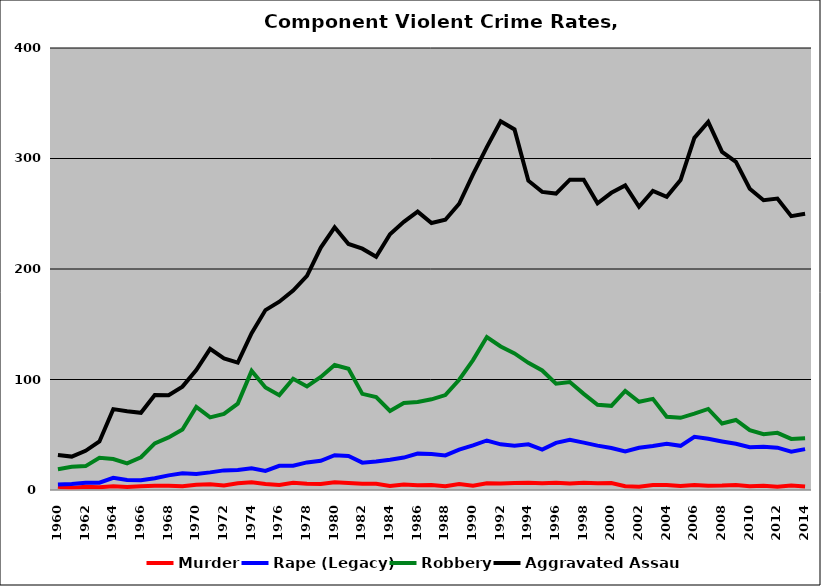
| Category | Murder | Rape (Legacy) | Robbery | Aggravated Assault |
|---|---|---|---|---|
| 1960.0 | 2.938 | 5.003 | 18.819 | 31.626 |
| 1961.0 | 1.869 | 5.378 | 20.966 | 30.219 |
| 1962.0 | 2.839 | 6.625 | 21.631 | 35.466 |
| 1963.0 | 2.562 | 6.652 | 29.124 | 43.955 |
| 1964.0 | 3.371 | 11.056 | 28 | 73.213 |
| 1965.0 | 2.686 | 9.132 | 24.038 | 71.218 |
| 1966.0 | 3.467 | 8.889 | 29.644 | 69.867 |
| 1967.0 | 3.956 | 10.681 | 42.154 | 85.978 |
| 1968.0 | 3.734 | 13.244 | 47.547 | 85.845 |
| 1969.0 | 3.49 | 15.08 | 54.761 | 93.537 |
| 1970.0 | 4.758 | 14.45 | 75.098 | 108.489 |
| 1971.0 | 5.093 | 15.943 | 65.678 | 127.768 |
| 1972.0 | 4.03 | 17.759 | 68.911 | 119.088 |
| 1973.0 | 6.011 | 18.034 | 78.148 | 115.27 |
| 1974.0 | 6.916 | 19.692 | 107.797 | 141.894 |
| 1975.0 | 5.382 | 17.247 | 92.766 | 162.814 |
| 1976.0 | 4.502 | 21.905 | 85.844 | 170.39 |
| 1977.0 | 6.578 | 21.969 | 100.731 | 180.525 |
| 1978.0 | 5.664 | 24.957 | 93.739 | 193.825 |
| 1979.0 | 5.488 | 26.425 | 102.279 | 219.375 |
| 1980.0 | 6.922 | 31.51 | 113.131 | 237.771 |
| 1981.0 | 6.342 | 30.785 | 109.66 | 222.638 |
| 1982.0 | 5.731 | 24.751 | 87.002 | 218.397 |
| 1983.0 | 5.649 | 25.856 | 84.041 | 211.01 |
| 1984.0 | 3.651 | 27.441 | 71.575 | 231.501 |
| 1985.0 | 4.939 | 29.347 | 78.735 | 242.735 |
| 1986.0 | 4.388 | 32.913 | 79.561 | 251.93 |
| 1987.0 | 4.443 | 32.633 | 82.068 | 241.599 |
| 1988.0 | 3.418 | 31.323 | 85.887 | 244.592 |
| 1989.0 | 5.491 | 36.49 | 99.801 | 259.053 |
| 1990.0 | 3.955 | 40.443 | 117.615 | 285.723 |
| 1991.0 | 6.132 | 44.81 | 138.397 | 310.261 |
| 1992.0 | 5.985 | 41.3 | 129.885 | 333.65 |
| 1993.0 | 6.361 | 40.142 | 123.588 | 326.314 |
| 1994.0 | 6.656 | 41.308 | 115.114 | 279.914 |
| 1995.0 | 6.199 | 36.569 | 108.187 | 269.786 |
| 1996.0 | 6.61 | 42.613 | 96.267 | 268.274 |
| 1997.0 | 5.78 | 45.434 | 97.688 | 280.809 |
| 1998.0 | 6.58 | 42.906 | 86.991 | 280.867 |
| 1999.0 | 6.029 | 40.127 | 77.127 | 259.49 |
| 2000.0 | 6.286 | 38.015 | 76.179 | 268.969 |
| 2001.0 | 3.405 | 34.972 | 89.67 | 275.672 |
| 2002.0 | 2.876 | 38.167 | 79.837 | 256.327 |
| 2003.0 | 4.588 | 39.82 | 82.465 | 270.627 |
| 2004.0 | 4.463 | 41.775 | 66.284 | 265.355 |
| 2005.0 | 3.675 | 39.954 | 65.316 | 280.441 |
| 2006.0 | 4.595 | 48.154 | 69.065 | 318.696 |
| 2007.0 | 3.927 | 46.362 | 73.343 | 333.07 |
| 2008.0 | 4.04 | 43.97 | 60.128 | 306.037 |
| 2009.0 | 4.435 | 41.827 | 63.361 | 296.94 |
| 2010.0 | 3.505 | 38.8 | 54.116 | 272.684 |
| 2011.0 | 3.867 | 39.089 | 50.446 | 262.264 |
| 2012.0 | 2.946 | 38.296 | 51.743 | 263.707 |
| 2013.0 | 4.04 | 34.636 | 46.239 | 247.842 |
| 2014.0 | 3.134 | 37.018 | 46.9 | 249.964 |